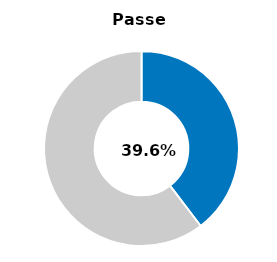
| Category | Series 0 |
|---|---|
| Passed | 0.396 |
| Other | 0.604 |